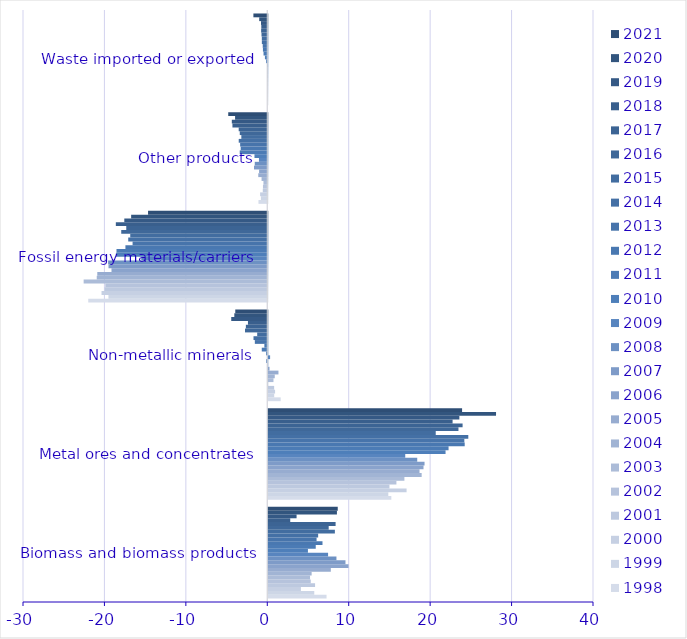
| Category | 1998 | 1999 | 2000 | 2001 | 2002 | 2003 | 2004 | 2005 | 2006 | 2007 | 2008 | 2009 | 2010 | 2011 | 2012 | 2013 | 2014 | 2015 | 2016 | 2017 | 2018 | 2019 | 2020 | 2021 |
|---|---|---|---|---|---|---|---|---|---|---|---|---|---|---|---|---|---|---|---|---|---|---|---|---|
| Biomass and biomass products | 7.155 | 5.646 | 4.006 | 5.745 | 5.214 | 5.129 | 5.324 | 7.68 | 9.854 | 9.479 | 8.37 | 7.344 | 4.868 | 5.828 | 6.657 | 5.93 | 6.124 | 8.178 | 7.418 | 8.266 | 2.696 | 3.474 | 8.429 | 8.53 |
| Metal ores and concentrates | 15.11 | 14.74 | 16.983 | 14.88 | 15.735 | 16.716 | 18.835 | 18.572 | 19.062 | 19.19 | 18.291 | 16.819 | 21.769 | 22.139 | 24.122 | 24.076 | 24.563 | 20.564 | 23.355 | 23.862 | 22.633 | 23.466 | 27.969 | 23.8 |
| Non-metallic minerals | 1.521 | 0.726 | 0.835 | 0.719 | -0.034 | 0.636 | 0.795 | 1.249 | 0.15 | 0.005 | -0.148 | 0.223 | -0.152 | -0.679 | -0.36 | -1.529 | -1.692 | -1.239 | -2.738 | -2.63 | -2.375 | -4.426 | -4.05 | -3.932 |
| Fossil energy materials/carriers | -21.988 | -19.506 | -20.354 | -19.978 | -19.893 | -22.552 | -20.945 | -20.876 | -19.131 | -19.5 | -19.543 | -15.474 | -18.591 | -18.518 | -17.422 | -16.543 | -17.077 | -16.83 | -17.935 | -17.319 | -18.599 | -17.559 | -16.719 | -14.642 |
| Other products | -1.083 | -0.784 | -0.882 | -0.553 | -0.531 | -0.472 | -0.702 | -1.108 | -1.006 | -1.629 | -1.537 | -1.024 | -1.573 | -3.384 | -3.263 | -3.334 | -3.507 | -3.187 | -3.379 | -3.511 | -4.279 | -4.357 | -3.956 | -4.795 |
| Waste imported or exported | 0 | 0 | 0 | 0 | -0.002 | -0.002 | -0.002 | -0.017 | -0.008 | -0.013 | -0.027 | -0.156 | -0.29 | -0.46 | -0.534 | -0.56 | -0.667 | -0.671 | -0.712 | -0.756 | -0.736 | -0.773 | -0.991 | -1.706 |